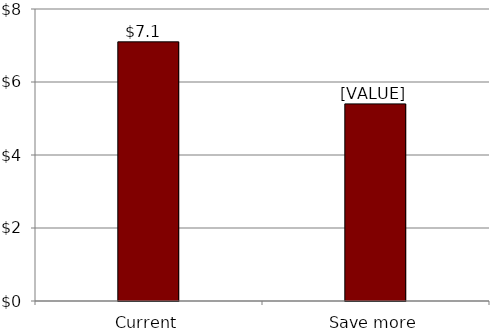
| Category | Series 0 |
|---|---|
| Current | 7.1 |
| Save more | 5.4 |